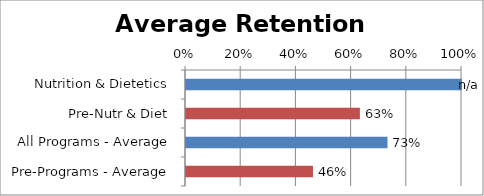
| Category | Series 0 |
|---|---|
| Nutrition & Dietetics | 1 |
| Pre-Nutr & Diet | 0.63 |
| All Programs - Average | 0.73 |
| Pre-Programs - Average | 0.46 |